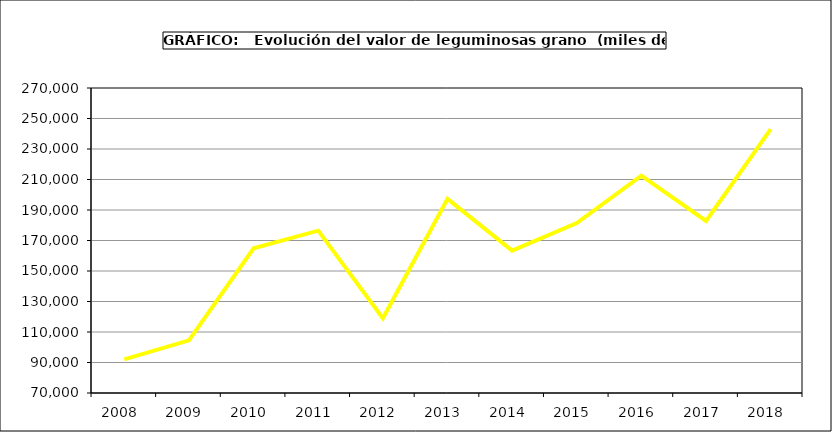
| Category | Valor |
|---|---|
| 2008.0 | 92023.432 |
| 2009.0 | 104521.39 |
| 2010.0 | 164853 |
| 2011.0 | 176441 |
| 2012.0 | 119054.324 |
| 2013.0 | 197282.867 |
| 2014.0 | 163368.079 |
| 2015.0 | 181398 |
| 2016.0 | 212486.887 |
| 2017.0 | 182785.866 |
| 2018.0 | 243011.339 |